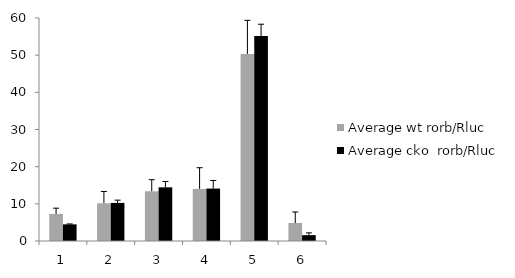
| Category | Average wt rorb/Rluc | Average cko  rorb/Rluc |
|---|---|---|
| 0 | 7.275 | 4.478 |
| 1 | 10.145 | 10.246 |
| 2 | 13.377 | 14.438 |
| 3 | 14.021 | 14.108 |
| 4 | 50.345 | 55.153 |
| 5 | 4.837 | 1.577 |